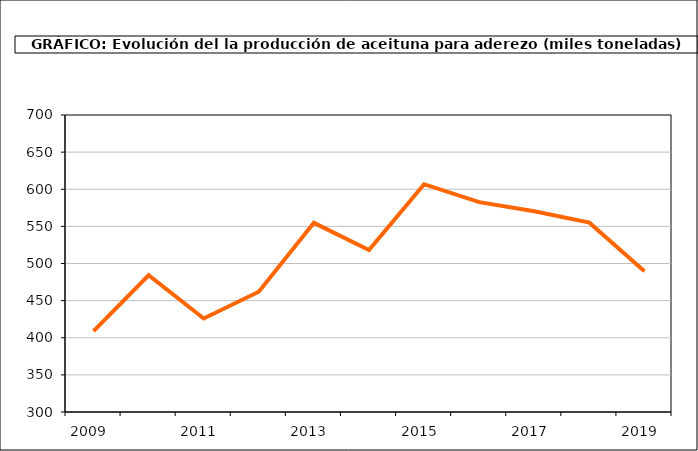
| Category | producción |
|---|---|
| 2009.0 | 408.897 |
| 2010.0 | 484.197 |
| 2011.0 | 425.955 |
| 2012.0 | 461.963 |
| 2013.0 | 554.749 |
| 2014.0 | 518.23 |
| 2015.0 | 606.789 |
| 2016.0 | 582.648 |
| 2017.0 | 570.295 |
| 2018.0 | 555.033 |
| 2019.0 | 489.721 |